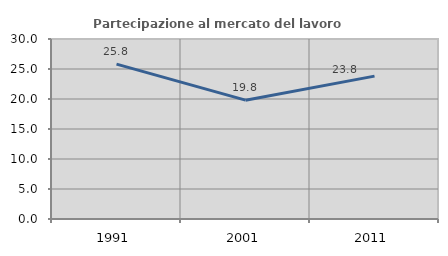
| Category | Partecipazione al mercato del lavoro  femminile |
|---|---|
| 1991.0 | 25.821 |
| 2001.0 | 19.804 |
| 2011.0 | 23.81 |